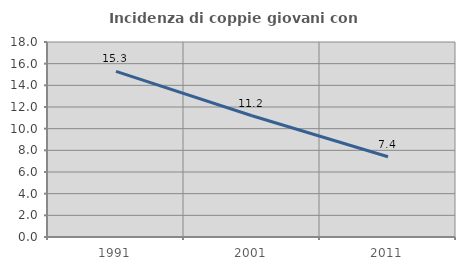
| Category | Incidenza di coppie giovani con figli |
|---|---|
| 1991.0 | 15.286 |
| 2001.0 | 11.193 |
| 2011.0 | 7.403 |